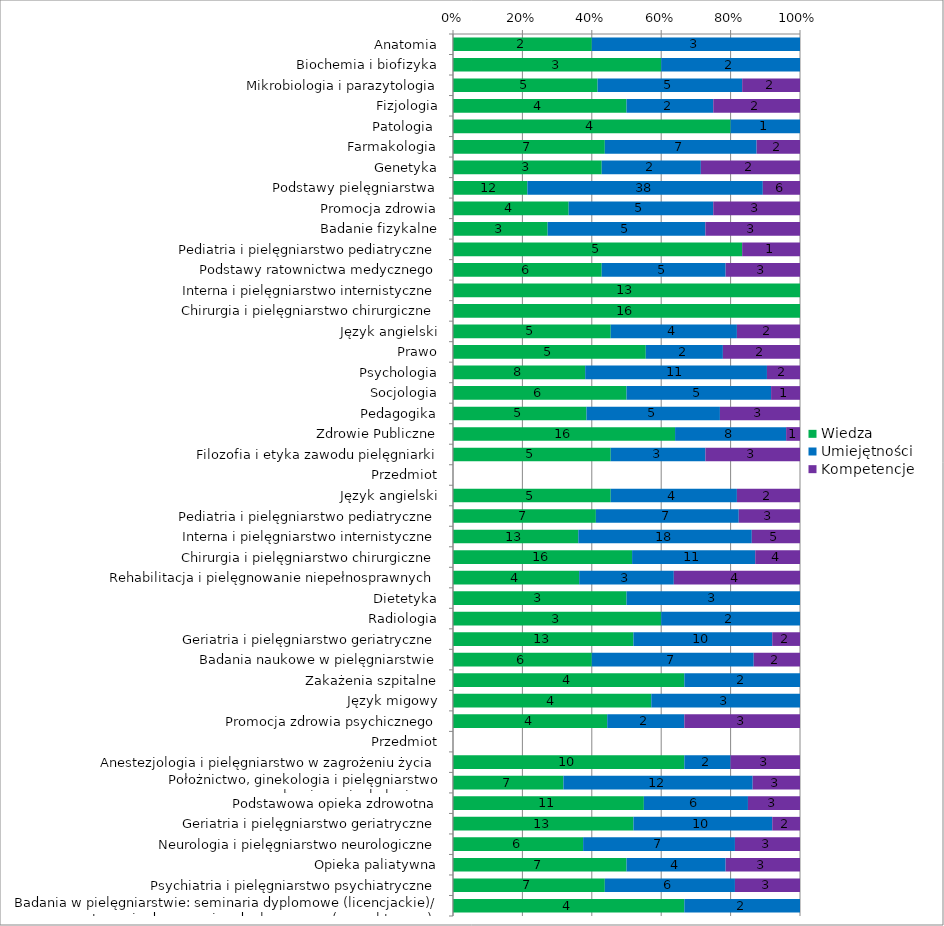
| Category | Wiedza | Umiejętności | Kompetencje |
|---|---|---|---|
| Anatomia | 2 | 3 | 0 |
| Biochemia i biofizyka | 3 | 2 | 0 |
| Mikrobiologia i parazytologia | 5 | 5 | 2 |
| Fizjologia | 4 | 2 | 2 |
| Patologia  | 4 | 1 | 0 |
| Farmakologia | 7 | 7 | 2 |
| Genetyka | 3 | 2 | 2 |
| Podstawy pielęgniarstwa | 12 | 38 | 6 |
| Promocja zdrowia | 4 | 5 | 3 |
| Badanie fizykalne | 3 | 5 | 3 |
| Pediatria i pielęgniarstwo pediatryczne | 5 | 0 | 1 |
| Podstawy ratownictwa medycznego | 6 | 5 | 3 |
| Interna i pielęgniarstwo internistyczne | 13 | 0 | 0 |
| Chirurgia i pielęgniarstwo chirurgiczne | 16 | 0 | 0 |
| Język angielski | 5 | 4 | 2 |
| Prawo | 5 | 2 | 2 |
| Psychologia | 8 | 11 | 2 |
| Socjologia | 6 | 5 | 1 |
| Pedagogika | 5 | 5 | 3 |
| Zdrowie Publiczne | 16 | 8 | 1 |
| Filozofia i etyka zawodu pielęgniarki | 5 | 3 | 3 |
| Przedmiot | 0 | 0 | 0 |
| Język angielski | 5 | 4 | 2 |
| Pediatria i pielęgniarstwo pediatryczne | 7 | 7 | 3 |
| Interna i pielęgniarstwo internistyczne | 13 | 18 | 5 |
| Chirurgia i pielęgniarstwo chirurgiczne | 16 | 11 | 4 |
| Rehabilitacja i pielęgnowanie niepełnosprawnych | 4 | 3 | 4 |
| Dietetyka | 3 | 3 | 0 |
| Radiologia | 3 | 2 | 0 |
| Geriatria i pielęgniarstwo geriatryczne | 13 | 10 | 2 |
| Badania naukowe w pielęgniarstwie | 6 | 7 | 2 |
| Zakażenia szpitalne | 4 | 2 | 0 |
| Język migowy | 4 | 3 | 0 |
| Promocja zdrowia psychicznego | 4 | 2 | 3 |
| Przedmiot | 0 | 0 | 0 |
| Anestezjologia i pielęgniarstwo w zagrożeniu życia | 10 | 2 | 3 |
| Położnictwo, ginekologia i pielęgniarstwo połozniczo-ginekologiczne | 7 | 12 | 3 |
| Podstawowa opieka zdrowotna | 11 | 6 | 3 |
| Geriatria i pielęgniarstwo geriatryczne | 13 | 10 | 2 |
| Neurologia i pielęgniarstwo neurologiczne | 6 | 7 | 3 |
| Opieka paliatywna | 7 | 4 | 3 |
| Psychiatria i pielęgniarstwo psychiatryczne | 7 | 6 | 3 |
| Badania w pielęgniarstwie: seminaria dyplomowe (licencjackie)/ przygotowanie do egzaminu dyplomowego (cz.praktyczna) | 4 | 2 | 0 |